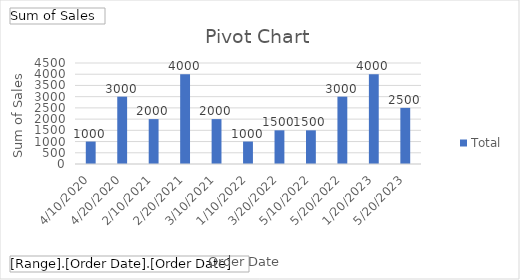
| Category | Total |
|---|---|
| 4/10/2020 | 1000 |
| 4/20/2020 | 3000 |
| 2/10/2021 | 2000 |
| 2/20/2021 | 4000 |
| 3/10/2021 | 2000 |
| 1/10/2022 | 1000 |
| 3/20/2022 | 1500 |
| 5/10/2022 | 1500 |
| 5/20/2022 | 3000 |
| 1/20/2023 | 4000 |
| 5/20/2023 | 2500 |